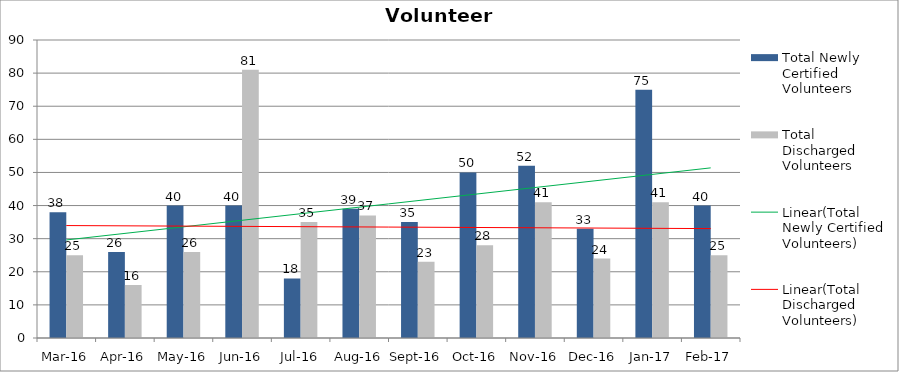
| Category | Total Newly Certified Volunteers | Total Discharged Volunteers |
|---|---|---|
| Mar-16 | 38 | 25 |
| Apr-16 | 26 | 16 |
| May-16 | 40 | 26 |
| Jun-16 | 40 | 81 |
| Jul-16 | 18 | 35 |
| Aug-16 | 39 | 37 |
| Sep-16 | 35 | 23 |
| Oct-16 | 50 | 28 |
| Nov-16 | 52 | 41 |
| Dec-16 | 33 | 24 |
| Jan-17 | 75 | 41 |
| Feb-17 | 40 | 25 |